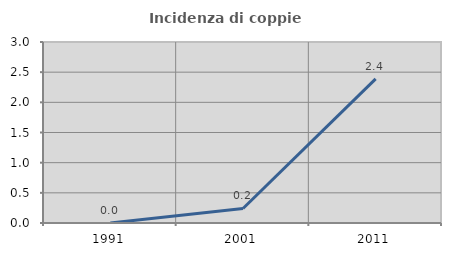
| Category | Incidenza di coppie miste |
|---|---|
| 1991.0 | 0 |
| 2001.0 | 0.241 |
| 2011.0 | 2.388 |